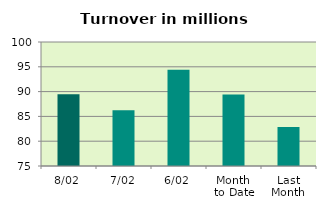
| Category | Series 0 |
|---|---|
| 8/02 | 89.484 |
| 7/02 | 86.26 |
| 6/02 | 94.411 |
| Month 
to Date | 89.411 |
| Last
Month | 82.868 |